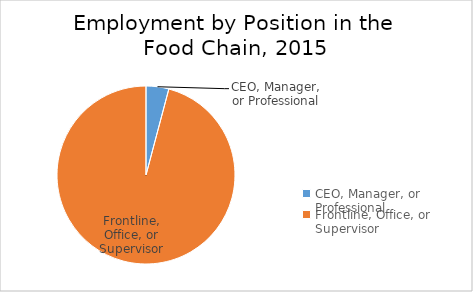
| Category | Series 0 |
|---|---|
| CEO, Manager, or Professional | 829640 |
| Frontline, Office, or Supervisor | 19246960 |